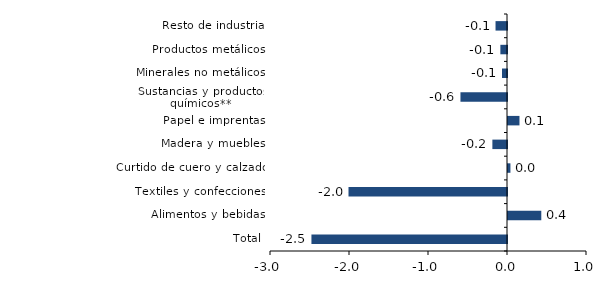
| Category | Series 0 |
|---|---|
| Total | -2.475 |
| Alimentos y bebidas | 0.421 |
| Textiles y confecciones | -2.006 |
| Curtido de cuero y calzado | 0.031 |
| Madera y muebles | -0.185 |
| Papel e imprentas | 0.145 |
| Sustancias y productos químicos** | -0.589 |
| Minerales no metálicos | -0.063 |
| Productos metálicos | -0.084 |
| Resto de industria | -0.145 |